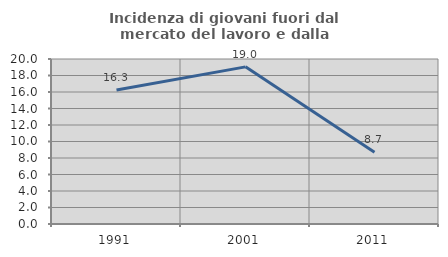
| Category | Incidenza di giovani fuori dal mercato del lavoro e dalla formazione  |
|---|---|
| 1991.0 | 16.25 |
| 2001.0 | 19.048 |
| 2011.0 | 8.696 |